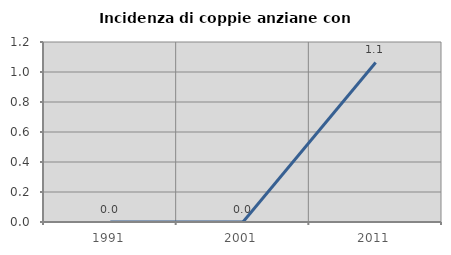
| Category | Incidenza di coppie anziane con figli |
|---|---|
| 1991.0 | 0 |
| 2001.0 | 0 |
| 2011.0 | 1.064 |